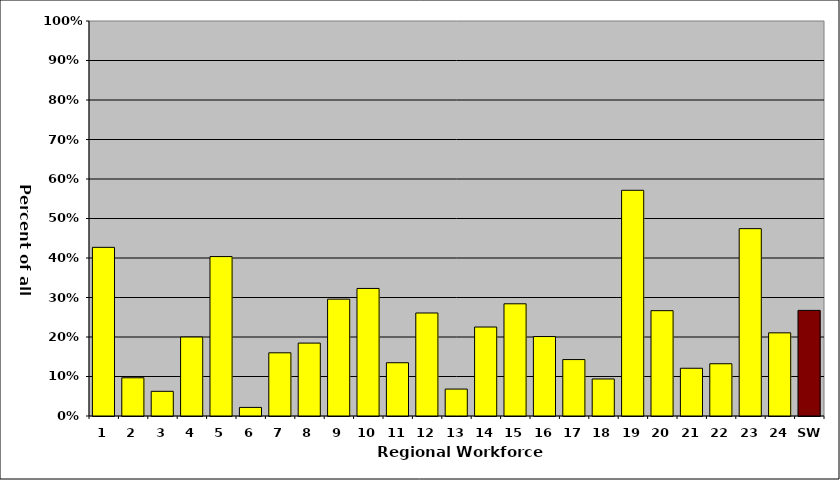
| Category | Series 0 |
|---|---|
| 1 | 0.427 |
| 2 | 0.097 |
| 3 | 0.062 |
| 4 | 0.2 |
| 5 | 0.404 |
| 6 | 0.022 |
| 7 | 0.16 |
| 8 | 0.185 |
| 9 | 0.296 |
| 10 | 0.323 |
| 11 | 0.135 |
| 12 | 0.261 |
| 13 | 0.068 |
| 14 | 0.225 |
| 15 | 0.284 |
| 16 | 0.201 |
| 17 | 0.143 |
| 18 | 0.094 |
| 19 | 0.571 |
| 20 | 0.267 |
| 21 | 0.121 |
| 22 | 0.132 |
| 23 | 0.474 |
| 24 | 0.211 |
| SW | 0.267 |